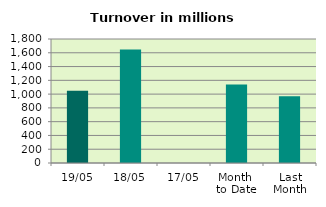
| Category | Series 0 |
|---|---|
| 19/05 | 1050.367 |
| 18/05 | 1648.951 |
| 17/05 | 0 |
| Month 
to Date | 1140.044 |
| Last
Month | 968.247 |